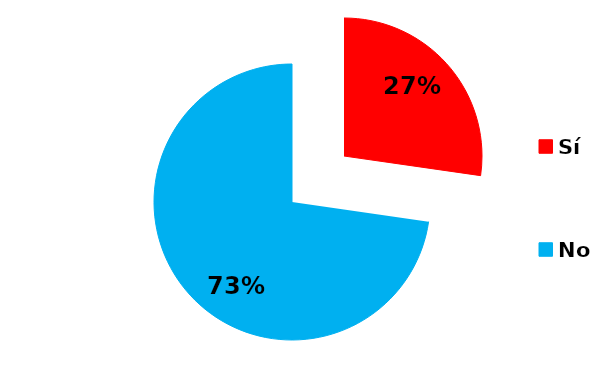
| Category | Series 0 |
|---|---|
| Sí | 12 |
| No | 32 |